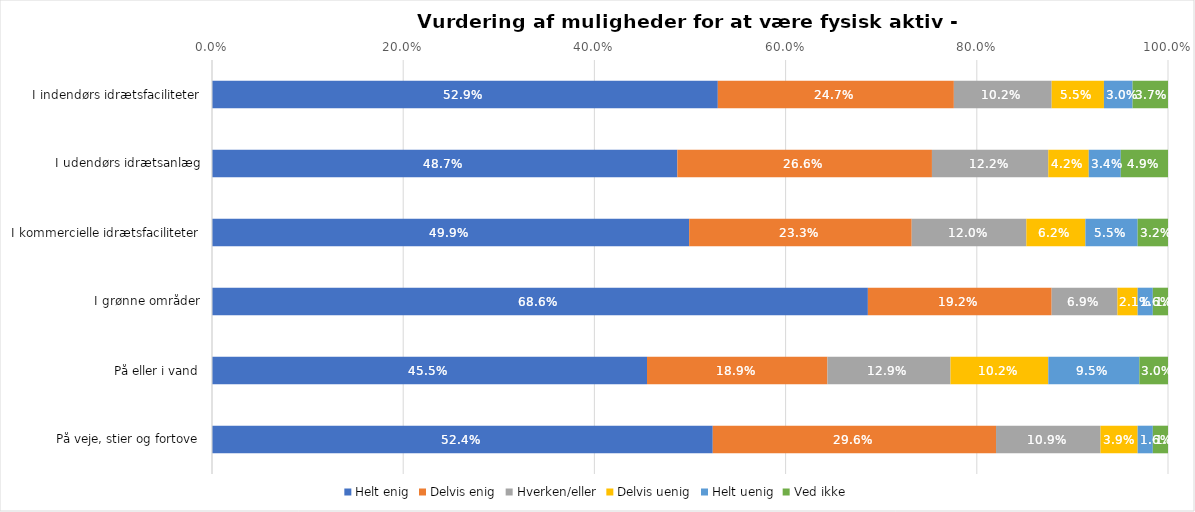
| Category | Helt enig | Delvis enig | Hverken/eller | Delvis uenig | Helt uenig | Ved ikke |
|---|---|---|---|---|---|---|
| I indendørs idrætsfaciliteter | 0.529 | 0.247 | 0.102 | 0.055 | 0.03 | 0.037 |
| I udendørs idrætsanlæg | 0.487 | 0.266 | 0.122 | 0.042 | 0.034 | 0.049 |
| I kommercielle idrætsfaciliteter | 0.499 | 0.233 | 0.12 | 0.062 | 0.055 | 0.032 |
| I grønne områder | 0.686 | 0.192 | 0.069 | 0.021 | 0.016 | 0.016 |
| På eller i vand | 0.455 | 0.189 | 0.129 | 0.102 | 0.095 | 0.03 |
| På veje, stier og fortove | 0.524 | 0.296 | 0.109 | 0.039 | 0.016 | 0.016 |